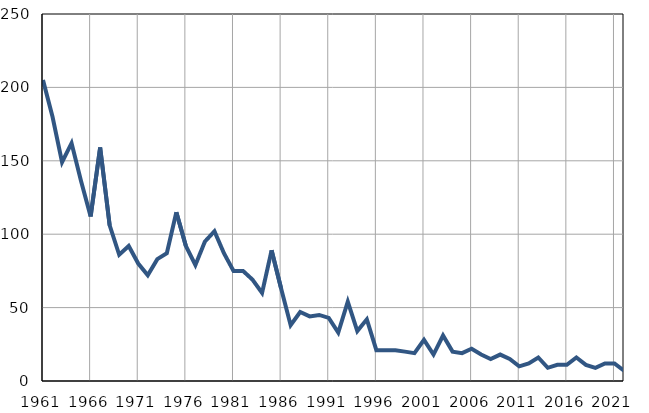
| Category | Infants
deaths |
|---|---|
| 1961.0 | 205 |
| 1962.0 | 180 |
| 1963.0 | 149 |
| 1964.0 | 162 |
| 1965.0 | 136 |
| 1966.0 | 112 |
| 1967.0 | 159 |
| 1968.0 | 106 |
| 1969.0 | 86 |
| 1970.0 | 92 |
| 1971.0 | 80 |
| 1972.0 | 72 |
| 1973.0 | 83 |
| 1974.0 | 87 |
| 1975.0 | 115 |
| 1976.0 | 92 |
| 1977.0 | 79 |
| 1978.0 | 95 |
| 1979.0 | 102 |
| 1980.0 | 87 |
| 1981.0 | 75 |
| 1982.0 | 75 |
| 1983.0 | 69 |
| 1984.0 | 60 |
| 1985.0 | 89 |
| 1986.0 | 63 |
| 1987.0 | 38 |
| 1988.0 | 47 |
| 1989.0 | 44 |
| 1990.0 | 45 |
| 1991.0 | 43 |
| 1992.0 | 33 |
| 1993.0 | 54 |
| 1994.0 | 34 |
| 1995.0 | 42 |
| 1996.0 | 21 |
| 1997.0 | 21 |
| 1998.0 | 21 |
| 1999.0 | 20 |
| 2000.0 | 19 |
| 2001.0 | 28 |
| 2002.0 | 18 |
| 2003.0 | 31 |
| 2004.0 | 20 |
| 2005.0 | 19 |
| 2006.0 | 22 |
| 2007.0 | 18 |
| 2008.0 | 15 |
| 2009.0 | 18 |
| 2010.0 | 15 |
| 2011.0 | 10 |
| 2012.0 | 12 |
| 2013.0 | 16 |
| 2014.0 | 9 |
| 2015.0 | 11 |
| 2016.0 | 11 |
| 2017.0 | 16 |
| 2018.0 | 11 |
| 2019.0 | 9 |
| 2020.0 | 12 |
| 2021.0 | 12 |
| 2022.0 | 7 |